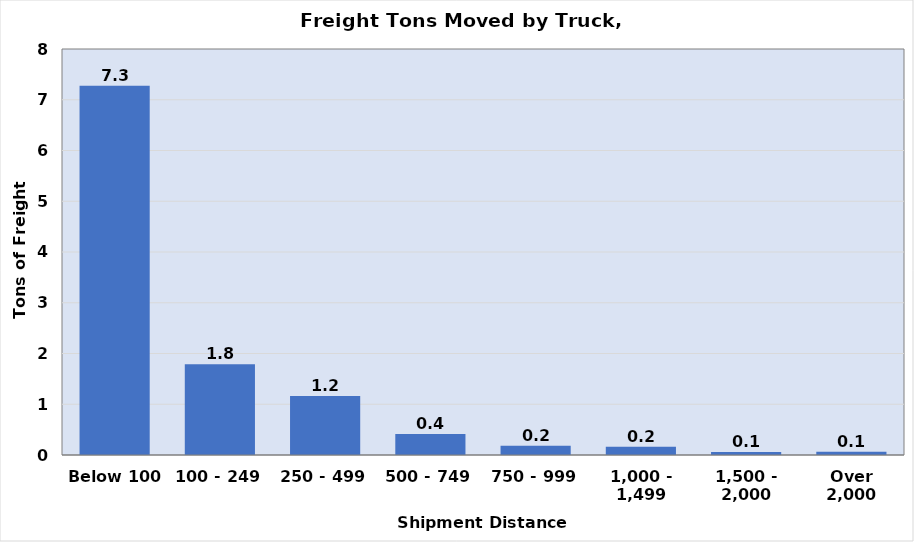
| Category | Tons of Freight 
Moved by Truck (Billions) |
|---|---|
| Below 100 | 7.278 |
| 100 - 249 | 1.786 |
| 250 - 499 | 1.164 |
| 500 - 749 | 0.414 |
| 750 - 999 | 0.18 |
| 1,000 - 1,499 | 0.164 |
| 1,500 - 2,000 | 0.057 |
| Over 2,000 | 0.064 |